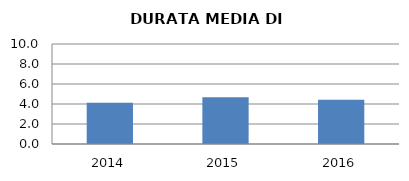
| Category | 2014 2015 2016 |
|---|---|
| 2014.0 | 4.12 |
| 2015.0 | 4.681 |
| 2016.0 | 4.422 |